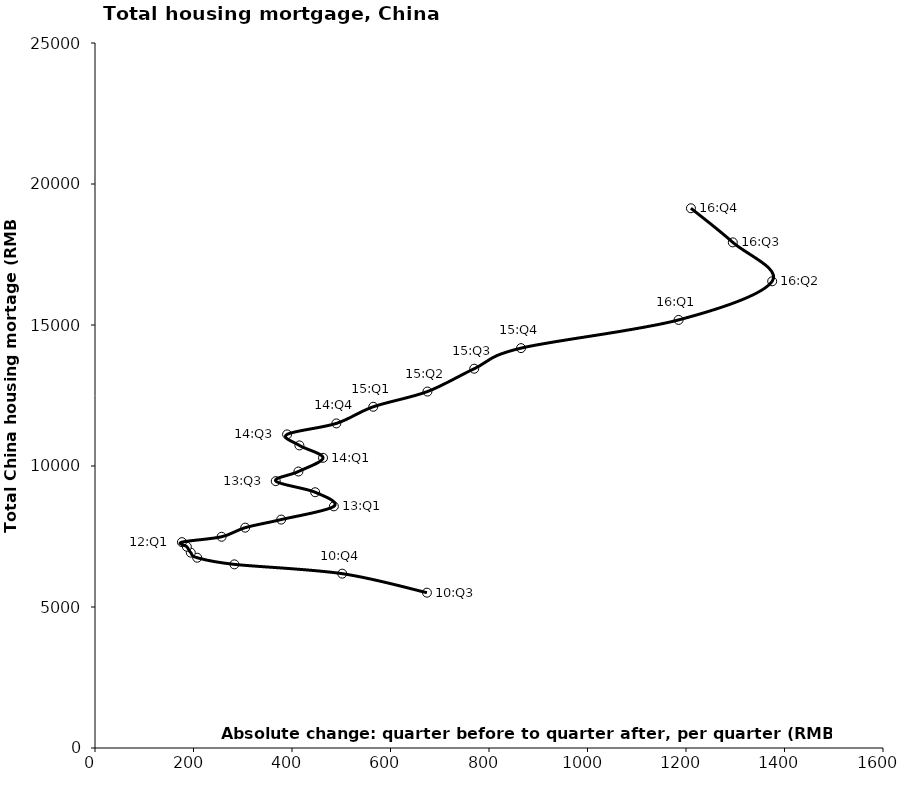
| Category | Series 0 |
|---|---|
| 674.0 | 5508 |
| 502.0 | 6182 |
| 283.0 | 6512 |
| 207.5 | 6748 |
| 194.5 | 6927 |
| 186.5 | 7137 |
| 176.5 | 7300 |
| 257.0 | 7490 |
| 305.0 | 7814 |
| 378.0 | 8100 |
| 485.0 | 8570 |
| 447.0 | 9070 |
| 367.0 | 9464 |
| 413.0 | 9804 |
| 463.0 | 10290 |
| 415.0 | 10730 |
| 390.0 | 11120 |
| 490.0 | 11510 |
| 565.0 | 12100 |
| 675.0 | 12640 |
| 770.0 | 13450 |
| 865.0 | 14180 |
| 1185.0 | 15180 |
| 1375.0 | 16550 |
| 1295.0 | 17930 |
| 1210.0 | 19140 |